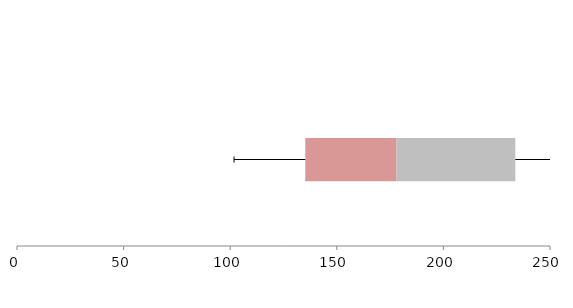
| Category | Series 1 | Series 2 | Series 3 |
|---|---|---|---|
| 0 | 135.221 | 42.792 | 55.712 |